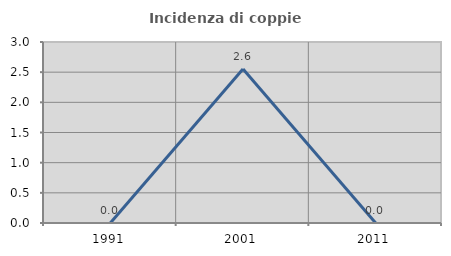
| Category | Incidenza di coppie miste |
|---|---|
| 1991.0 | 0 |
| 2001.0 | 2.553 |
| 2011.0 | 0 |